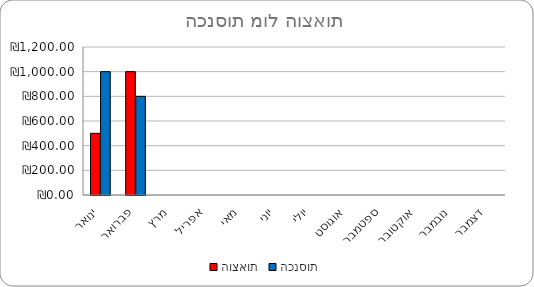
| Category | הוצאות | הכנסות |
|---|---|---|
| ינואר | 500 | 1000 |
| פברואר | 1000 | 800 |
| מרץ | 0 | 0 |
| אפריל | 0 | 0 |
| מאי | 0 | 0 |
| יוני | 0 | 0 |
| יולי | 0 | 0 |
| אוגוסט | 0 | 0 |
| ספטמבר | 0 | 0 |
| אוקטובר | 0 | 0 |
| נובמבר | 0 | 0 |
| דצמבר | 0 | 0 |